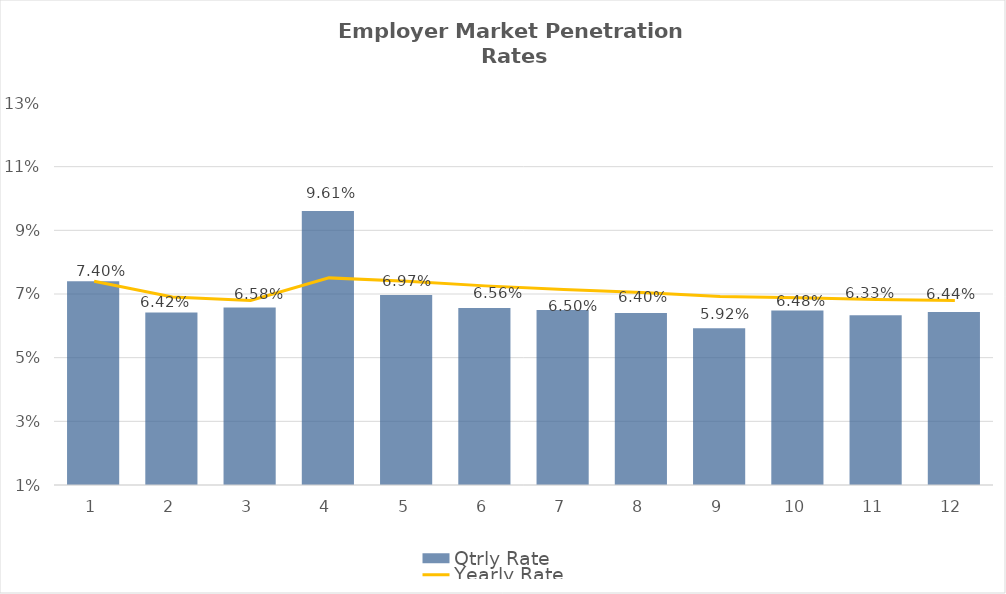
| Category | Qtrly Rate |
|---|---|
| 0 | 0.074 |
| 1 | 0.064 |
| 2 | 0.066 |
| 3 | 0.096 |
| 4 | 0.07 |
| 5 | 0.066 |
| 6 | 0.065 |
| 7 | 0.064 |
| 8 | 0.059 |
| 9 | 0.065 |
| 10 | 0.063 |
| 11 | 0.064 |